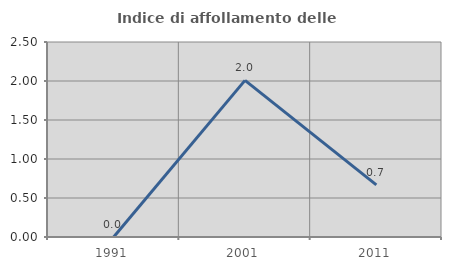
| Category | Indice di affollamento delle abitazioni  |
|---|---|
| 1991.0 | 0 |
| 2001.0 | 2.008 |
| 2011.0 | 0.669 |